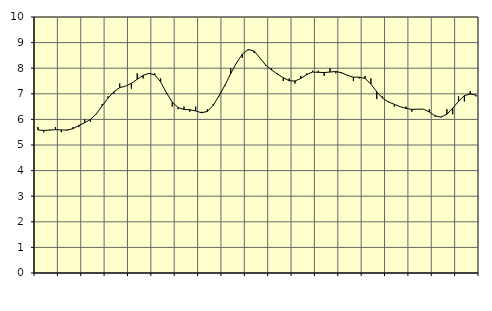
| Category | Piggar | Series 1 |
|---|---|---|
| nan | 5.7 | 5.59 |
| 1.0 | 5.5 | 5.57 |
| 1.0 | 5.6 | 5.58 |
| 1.0 | 5.7 | 5.6 |
| nan | 5.5 | 5.59 |
| 2.0 | 5.6 | 5.58 |
| 2.0 | 5.7 | 5.64 |
| 2.0 | 5.7 | 5.76 |
| nan | 6 | 5.87 |
| 3.0 | 5.9 | 6 |
| 3.0 | 6.2 | 6.22 |
| 3.0 | 6.6 | 6.53 |
| nan | 6.9 | 6.83 |
| 4.0 | 7 | 7.08 |
| 4.0 | 7.4 | 7.24 |
| 4.0 | 7.3 | 7.3 |
| nan | 7.2 | 7.41 |
| 5.0 | 7.8 | 7.57 |
| 5.0 | 7.6 | 7.72 |
| 5.0 | 7.8 | 7.8 |
| nan | 7.8 | 7.74 |
| 6.0 | 7.6 | 7.47 |
| 6.0 | 7 | 7.04 |
| 6.0 | 6.5 | 6.67 |
| nan | 6.4 | 6.46 |
| 7.0 | 6.5 | 6.39 |
| 7.0 | 6.3 | 6.38 |
| 7.0 | 6.5 | 6.33 |
| nan | 6.3 | 6.26 |
| 8.0 | 6.4 | 6.31 |
| 8.0 | 6.6 | 6.55 |
| 8.0 | 6.9 | 6.92 |
| nan | 7.3 | 7.33 |
| 9.0 | 8 | 7.79 |
| 9.0 | 8.2 | 8.21 |
| 9.0 | 8.4 | 8.55 |
| nan | 8.7 | 8.73 |
| 10.0 | 8.6 | 8.67 |
| 10.0 | 8.4 | 8.4 |
| 10.0 | 8.1 | 8.12 |
| nan | 8 | 7.93 |
| 11.0 | 7.8 | 7.77 |
| 11.0 | 7.5 | 7.63 |
| 11.0 | 7.6 | 7.51 |
| nan | 7.4 | 7.5 |
| 12.0 | 7.7 | 7.6 |
| 12.0 | 7.8 | 7.75 |
| 12.0 | 7.9 | 7.85 |
| nan | 7.9 | 7.84 |
| 13.0 | 7.7 | 7.83 |
| 13.0 | 8 | 7.85 |
| 13.0 | 7.8 | 7.87 |
| nan | 7.8 | 7.82 |
| 14.0 | 7.7 | 7.72 |
| 14.0 | 7.5 | 7.65 |
| 14.0 | 7.6 | 7.65 |
| nan | 7.7 | 7.6 |
| 15.0 | 7.6 | 7.38 |
| 15.0 | 6.8 | 7.08 |
| 15.0 | 6.9 | 6.83 |
| nan | 6.7 | 6.68 |
| 16.0 | 6.5 | 6.59 |
| 16.0 | 6.5 | 6.5 |
| 16.0 | 6.5 | 6.43 |
| nan | 6.3 | 6.39 |
| 17.0 | 6.4 | 6.4 |
| 17.0 | 6.4 | 6.4 |
| 17.0 | 6.4 | 6.29 |
| nan | 6.1 | 6.14 |
| 18.0 | 6.1 | 6.09 |
| 18.0 | 6.4 | 6.2 |
| 18.0 | 6.2 | 6.44 |
| nan | 6.9 | 6.71 |
| 19.0 | 6.7 | 6.93 |
| 19.0 | 7.1 | 6.99 |
| 19.0 | 6.9 | 6.95 |